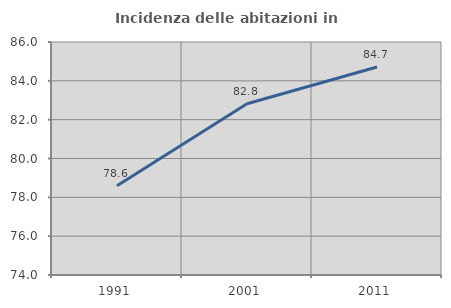
| Category | Incidenza delle abitazioni in proprietà  |
|---|---|
| 1991.0 | 78.597 |
| 2001.0 | 82.816 |
| 2011.0 | 84.709 |